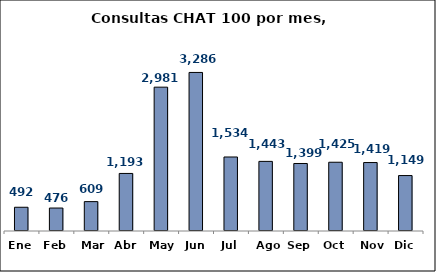
| Category | Series 0 |
|---|---|
| Ene | 492 |
| Feb | 476 |
| Mar | 609 |
| Abr | 1193 |
| May | 2981 |
| Jun | 3286 |
| Jul | 1534 |
| Ago | 1443 |
| Sep | 1399 |
| Oct | 1425 |
| Nov | 1419 |
| Dic | 1149 |